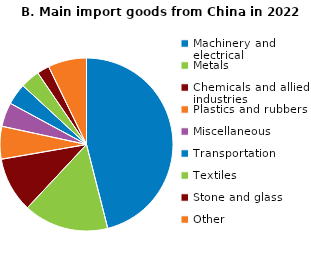
| Category | Series 0 |
|---|---|
| Machinery and electrical | 46 |
| Metals | 15.9 |
| Chemicals and allied industries | 10.3 |
| Plastics and rubbers | 6.1 |
| Miscellaneous | 4.5 |
| Transportation | 4 |
| Textiles | 3.6 |
| Stone and glass | 2.3 |
| Other | 7.2 |